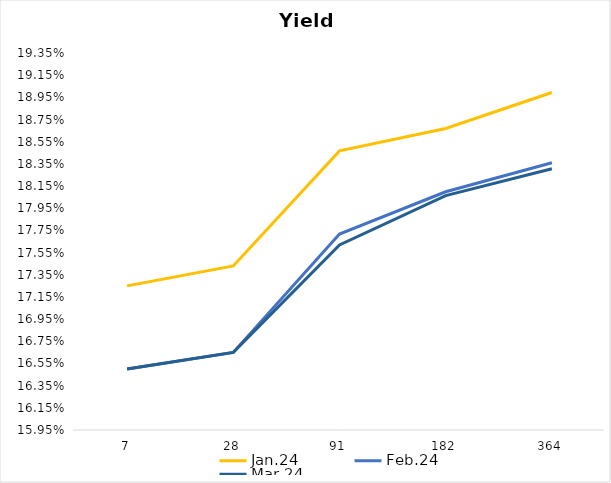
| Category | Jan.24 | Feb.24 | Mar.24 |
|---|---|---|---|
| 7.0 | 0.172 | 0.165 | 0.165 |
| 28.0 | 0.174 | 0.166 | 0.166 |
| 91.0 | 0.185 | 0.177 | 0.176 |
| 182.0 | 0.187 | 0.181 | 0.181 |
| 364.0 | 0.19 | 0.184 | 0.183 |